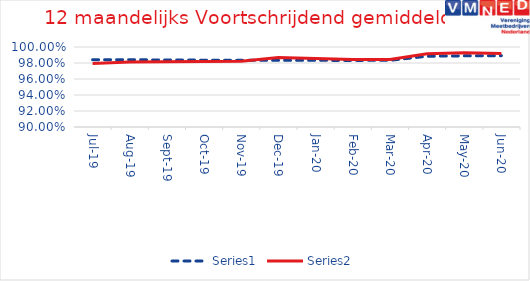
| Category | Series 0 | Series 1 |
|---|---|---|
| 2019-07-01 | 0.984 | 0.979 |
| 2019-08-01 | 0.984 | 0.981 |
| 2019-09-01 | 0.984 | 0.982 |
| 2019-10-01 | 0.984 | 0.982 |
| 2019-11-01 | 0.983 | 0.982 |
| 2019-12-01 | 0.983 | 0.987 |
| 2020-01-01 | 0.983 | 0.986 |
| 2020-02-01 | 0.983 | 0.985 |
| 2020-03-01 | 0.983 | 0.984 |
| 2020-04-01 | 0.988 | 0.992 |
| 2020-05-01 | 0.989 | 0.993 |
| 2020-06-01 | 0.989 | 0.992 |